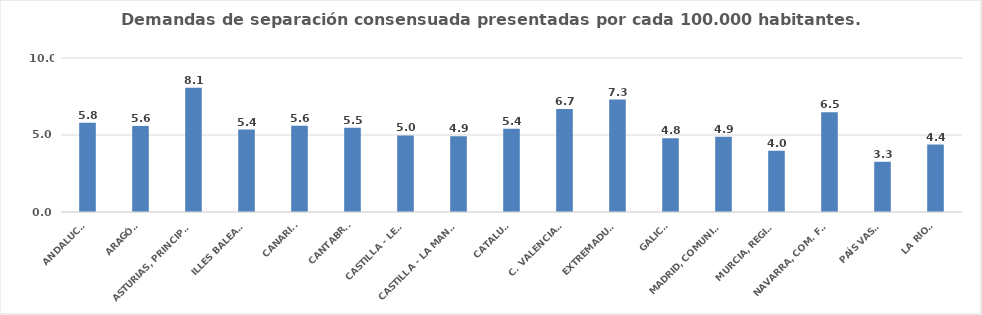
| Category | Series 0 |
|---|---|
| ANDALUCÍA | 5.803 |
| ARAGÓN | 5.579 |
| ASTURIAS, PRINCIPADO | 8.062 |
| ILLES BALEARS | 5.354 |
| CANARIAS | 5.602 |
| CANTABRIA | 5.466 |
| CASTILLA - LEÓN | 4.973 |
| CASTILLA - LA MANCHA | 4.919 |
| CATALUÑA | 5.403 |
| C. VALENCIANA | 6.689 |
| EXTREMADURA | 7.3 |
| GALICIA | 4.795 |
| MADRID, COMUNIDAD | 4.889 |
| MURCIA, REGIÓN | 3.982 |
| NAVARRA, COM. FORAL | 6.475 |
| PAÍS VASCO | 3.261 |
| LA RIOJA | 4.376 |